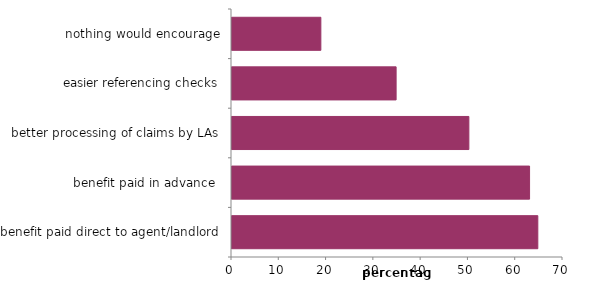
| Category | Series 0 |
|---|---|
| benefit paid direct to agent/landlord | 64.674 |
| benefit paid in advance  | 62.932 |
| better processing of claims by LAs | 50.094 |
| easier referencing checks | 34.709 |
| nothing would encourage | 18.79 |